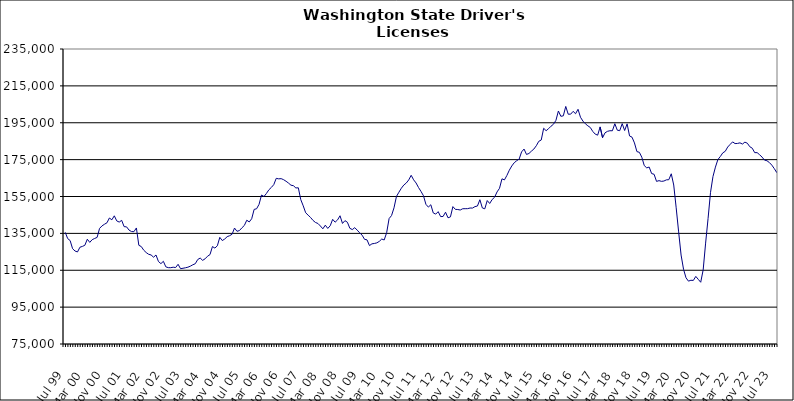
| Category | Series 0 |
|---|---|
| Jul 99 | 135560 |
| Aug 99 | 132182 |
| Sep 99 | 131104 |
| Oct 99 | 126694 |
| Nov 99 | 125425 |
| Dec 99 | 124927 |
| Jan 00 | 127499 |
| Feb 00 | 127927 |
| Mar 00 | 128547 |
| Apr 00 | 131834 |
| May 00 | 130120 |
| Jun 00 | 131595 |
| Jul 00 | 132236 |
| Aug 00 | 132819 |
| Sep 00 | 137711 |
| Oct 00 | 139063 |
| Nov 00 | 139952 |
| Dec 00 | 140732 |
| Jan 01 | 143338 |
| Feb 01 | 142359 |
| Mar 01 | 144523 |
| Apr 01 | 141758 |
| May 01 | 141135 |
| Jun 01 | 142064 |
| Jul 01 | 138646 |
| Aug 01 | 138530 |
| Sep 01 | 136784 |
| Oct 01 | 135996 |
| Nov 01 | 135917 |
| Dec 01 | 137940 |
| Jan 02 | 128531 |
| Feb 02 | 127848 |
| Mar 02 | 125876 |
| Apr 02 | 124595 |
| May 02 | 123660 |
| Jun 02 | 123282 |
| Jul 02 | 122089 |
| Aug 02 | 123279 |
| Sep 02 | 119727 |
| Oct 02 | 118588 |
| Nov 02 | 119854 |
| Dec 02 | 116851 |
| Jan 03 | 116407 |
| Feb 03 | 116382 |
| Mar 03 | 116648 |
| Apr 03 | 116471 |
| May 03 | 118231 |
| Jun 03 | 115831 |
| Jul 03 | 116082 |
| Aug 03 | 116341 |
| Sep 03 | 116653 |
| Oct 03 | 117212 |
| Nov 03 | 117962 |
| Dec 03 | 118542 |
| Jan 04 | 120817 |
| Feb 04 | 121617 |
| Mar 04 | 120369 |
| Apr 04 | 121200 |
| May 04 | 122609 |
| Jun 04 | 123484 |
| Jul 04 | 127844 |
| Aug 04 | 127025 |
| Sep 04 | 128273 |
| Oct 04 | 132853 |
| Nov 04 | 131106 |
| Dec 04 | 131935 |
| Jan 05 | 133205 |
| Feb 05 | 133736 |
| Mar 05 | 134528 |
| Apr 05 | 137889 |
| May 05 | 136130 |
| Jun 05 | 136523 |
| Jul 05 | 137997 |
| Aug 05 | 139294 |
| Sep 05 | 142140 |
| Oct 05 | 141192 |
| Nov 05 | 142937 |
| Dec 05 | 148013 |
| Jan 06 | 148341 |
| Feb 06 | 150744 |
| Mar 06 | 155794 |
| Apr 06 | 154984 |
| May 06 | 156651 |
| Jun 06 | 158638 |
| Jul 06 | 159911 |
| Aug 06 | 161445 |
| Sep 06 | 164852 |
| Oct 06 | 164570 |
| Nov 06 | 164679 |
| Dec 06 | 164127 |
| Jan 07 | 163271 |
| Feb 07 | 162273 |
| Mar 07 | 161140 |
| Apr 07 | 160860 |
| May 07 | 159633 |
| Jun 07 | 159724 |
| Jul 07 | 153303 |
| Aug 07 | 149939 |
| Sep 07 | 146172 |
| Oct 07 | 144876 |
| Nov 07 | 143613 |
| Dec 07 | 142022 |
| Jan 08 | 140909 |
| Feb 08 | 140368 |
| Mar 08 | 138998 |
| Apr 08 | 137471 |
| May 08 | 139453 |
| Jun 08 | 137680 |
| Jul 08 | 139120 |
| Aug 08 | 142612 |
| Sep-08 | 141071 |
| Oct 08 | 142313 |
| Nov 08 | 144556 |
| Dec 08 | 140394 |
| Jan 09 | 141903 |
| Feb 09 | 141036 |
| Mar 09 | 137751 |
| Apr 09 | 137060 |
| May 09 | 138101 |
| Jun 09 | 136739 |
| Jul 09 | 135317 |
| Aug 09 | 134020 |
| Sep 09 | 131756 |
| Oct 09 | 131488 |
| Nov 09 | 128370 |
| Dec 09 | 129323 |
| Jan 10 | 129531 |
| Feb 10 | 129848 |
| Mar 10 | 130654 |
| Apr 10 | 131929 |
| May 10 | 131429 |
| Jun 10 | 135357 |
| Jul 10 | 143032 |
| Aug 10 | 144686 |
| Sep 10 | 148856 |
| Oct 10 | 155042 |
| Nov 10 | 157328 |
| Dec 10 | 159501 |
| Jan 11 | 161221 |
| Feb 11 | 162312 |
| Mar 11 | 163996 |
| Apr 11 | 166495 |
| May 11 | 164040 |
| Jun 11 | 162324 |
| Jul 11 | 159862 |
| Aug 11 | 157738 |
| Sep 11 | 155430 |
| Oct 11 | 150762 |
| Nov 11 | 149255 |
| Dec 11 | 150533 |
| Jan 12 | 146068 |
| Feb 12 | 145446 |
| Mar 12 | 146788 |
| Apr 12 | 144110 |
| May 12 | 144162 |
| Jun 12 | 146482 |
| Jul 12 | 143445 |
| Aug 12 | 143950 |
| Sep 12 | 149520 |
| Oct 12 | 148033 |
| Nov 12 | 147926 |
| Dec 12 | 147674 |
| Jan 13 | 148360 |
| Feb-13 | 148388 |
| Mar-13 | 148414 |
| Apr 13 | 148749 |
| May 13 | 148735 |
| Jun-13 | 149521 |
| Jul 13 | 149837 |
| Aug 13 | 153252 |
| Sep 13 | 148803 |
| Oct 13 | 148315 |
| Nov 13 | 152804 |
| Dec 13 | 151209 |
| Jan 14 | 153357 |
| Feb-14 | 154608 |
| Mar 14 | 157479 |
| Apr 14 | 159441 |
| May 14 | 164591 |
| Jun 14 | 163995 |
| Jul-14 | 166411 |
| Aug-14 | 169272 |
| Sep 14 | 171565 |
| Oct 14 | 173335 |
| Nov 14 | 174406 |
| Dec 14 | 175302 |
| Jan 15 | 179204 |
| Feb 15 | 180737 |
| Mar 15 | 177810 |
| Apr-15 | 178331 |
| May 15 | 179601 |
| Jun-15 | 180729 |
| Jul 15 | 182540 |
| Aug 15 | 184924 |
| Sep 15 | 185620 |
| Oct 15 | 192002 |
| Nov 15 | 190681 |
| Dec 15 | 191795 |
| Jan 16 | 193132 |
| Feb 16 | 194206 |
| Mar 16 | 196319 |
| Apr 16 | 201373 |
| May 16 | 198500 |
| Jun 16 | 198743 |
| Jul 16 | 203841 |
| Aug 16 | 199630 |
| Sep 16 | 199655 |
| Oct 16 | 201181 |
| Nov 16 | 199888 |
| Dec 16 | 202304 |
| Jan 17 | 197977 |
| Feb 17 | 195889 |
| Mar 17 | 194438 |
| Apr 17 | 193335 |
| May 17 | 192430 |
| Jun 17 | 190298 |
| Jul 17 | 188832 |
| Aug 17 | 188264 |
| Sep 17 | 192738 |
| Oct 17 | 186856 |
| Nov 17 | 189537 |
| Dec 17 | 190341 |
| Jan 18 | 190670 |
| Feb 18 | 190645 |
| Mar 18 | 194476 |
| Apr 18 | 190971 |
| May 18 | 190707 |
| Jun 18 | 194516 |
| Jul 18 | 190783 |
| Aug 18 | 194390 |
| Sep 18 | 187831 |
| Oct 18 | 187188 |
| Nov 18 | 184054 |
| Dec 18 | 179347 |
| Jan 19 | 178958 |
| Feb 19 | 176289 |
| Mar 19 | 171747 |
| Apr 19 | 170532 |
| May 19 | 170967 |
| Jun 19 | 167444 |
| Jul 19 | 167059 |
| Aug 19 | 163194 |
| Sep 19 | 163599 |
| Oct 19 | 163212 |
| Nov 19 | 163388 |
| Dec 19 | 164024 |
| Jan 20 | 164114 |
| Feb 20 | 167320 |
| Mar 20 | 161221 |
| Apr 20 | 148866 |
| May 20 | 135821 |
| Jun 20 | 123252 |
| Jul 20 | 115526 |
| Aug 20 | 110940 |
| Sep 20 | 109099 |
| Oct 20 | 109566 |
| Nov 20 | 109488 |
| Dec 20 | 111658 |
| Jan 21 | 110070 |
| Feb 21 | 108491 |
| Mar 21 | 115176 |
| Apr 21 | 129726 |
| May 21 | 143052 |
| Jun 21 | 157253 |
| Jul 21 | 165832 |
| Aug 21 | 170937 |
| Sep 21 | 175042 |
| Oct 21 | 176696 |
| Nov 21 | 178677 |
| Dec 21 | 179501 |
| Jan 22 | 181825 |
| Feb 22 | 183258 |
| Mar 22 | 184618 |
| Apr 22 | 183710 |
| May 22 | 183784 |
| Jun 22 | 184101 |
| Jul 22 | 183443 |
| Aug 22 | 184475 |
| Sep 22 | 183902 |
| Oct 22 | 181994 |
| Nov 22 | 181207 |
| Dec 22 | 178793 |
| Jan 23 | 178782 |
| Feb 23 | 177647 |
| Mar 23 | 176386 |
| Apr 23 | 174729 |
| May 23 | 174390 |
| Jun 23 | 173391 |
| Jul 23 | 171988 |
| Aug 23 | 170100 |
| Sep 23 | 167953 |